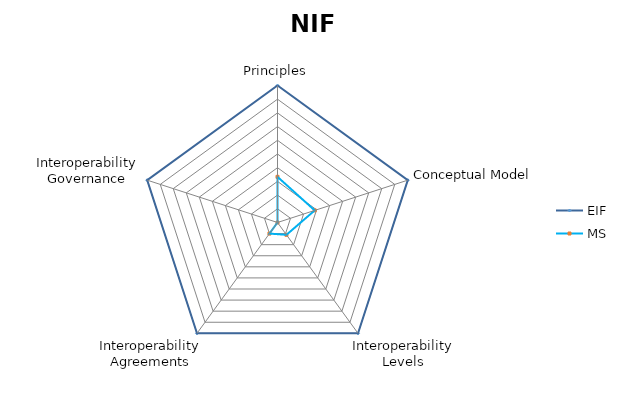
| Category | EIF | MS |
|---|---|---|
| Principles | 1 | 0.333 |
| Conceptual Model | 1 | 0.286 |
| Interoperability Levels | 1 | 0.111 |
| Interoperability Agreements | 1 | 0.1 |
| Interoperability Governance | 1 | 0 |